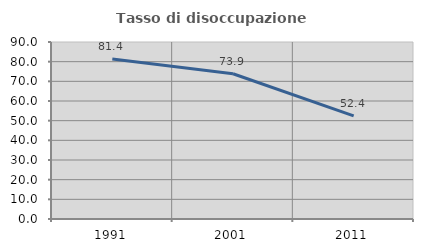
| Category | Tasso di disoccupazione giovanile  |
|---|---|
| 1991.0 | 81.373 |
| 2001.0 | 73.874 |
| 2011.0 | 52.439 |